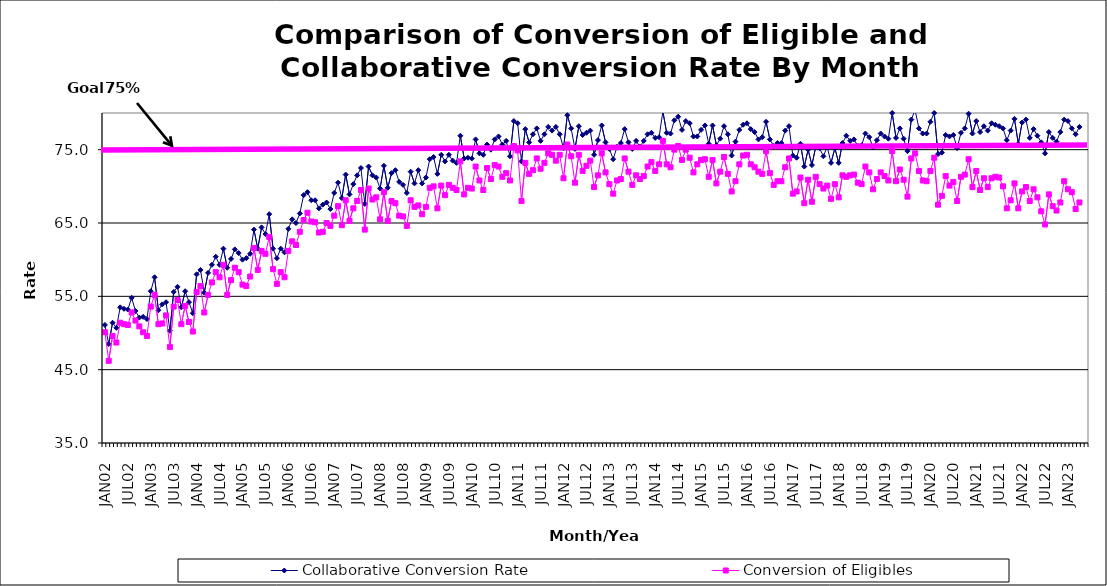
| Category | Collaborative Conversion Rate | Conversion of Eligibles |
|---|---|---|
| JAN02 | 51.1 | 50.1 |
| FEB02 | 48.5 | 46.2 |
| MAR02 | 51.4 | 49.6 |
| APR02 | 50.7 | 48.7 |
| MAY02 | 53.5 | 51.4 |
| JUN02 | 53.3 | 51.2 |
| JUL02 | 53.2 | 51.1 |
| AUG02 | 54.8 | 52.8 |
| SEP02 | 53 | 51.7 |
| OCT02 | 52.1 | 50.9 |
| NOV02 | 52.2 | 50.1 |
| DEC02 | 51.9 | 49.6 |
| JAN03 | 55.7 | 53.6 |
| FEB03 | 57.6 | 55.2 |
| MAR03 | 53.1 | 51.2 |
| APR03 | 53.9 | 51.3 |
| MAY03 | 54.2 | 52.4 |
| JUN03 | 50.3 | 48.1 |
| JUL03 | 55.6 | 53.6 |
| AUG03 | 56.3 | 54.5 |
| SEP03 | 53.5 | 51.2 |
| OCT03 | 55.7 | 53.7 |
| NOV03 | 54.2 | 51.5 |
| DEC03 | 52.7 | 50.2 |
| JAN04 | 58 | 55.6 |
| FEB04 | 58.6 | 56.4 |
| MAR04 | 55.5 | 52.8 |
| APR04 | 58.2 | 55.2 |
| MAY04 | 59.3 | 56.9 |
| JUN04 | 60.4 | 58.3 |
| JUL04 | 59.3 | 57.6 |
| AUG04 | 61.5 | 59.3 |
| SEP04 | 58.9 | 55.2 |
| OCT04 | 60.1 | 57.2 |
| NOV04 | 61.4 | 58.9 |
| DEC04 | 60.9 | 58.3 |
| JAN05 | 60 | 56.6 |
| FEB05 | 60.2 | 56.4 |
| MAR05 | 60.8 | 57.7 |
| APR05 | 64.1 | 61.6 |
| MAY05 | 61.5 | 58.6 |
| JUN05 | 64.4 | 61.2 |
| JUL05 | 63.5 | 60.8 |
| AUG05 | 66.2 | 63.1 |
| SEP05 | 61.5 | 58.7 |
| OCT05 | 60.2 | 56.7 |
| NOV05 | 61.5 | 58.3 |
| DEC05 | 61 | 57.6 |
| JAN06 | 64.2 | 61.2 |
| FEB06 | 65.5 | 62.5 |
| MAR06 | 65 | 62 |
| APR06 | 66.3 | 63.8 |
| MAY06 | 68.8 | 65.4 |
| JUN06 | 69.2 | 66.4 |
| JUL06 | 68.1 | 65.2 |
| AUG06 | 68.1 | 65.1 |
| SEP06 | 67 | 63.7 |
| OCT06 | 67.5 | 63.8 |
| NOV06 | 67.8 | 65 |
| DEC06 | 66.9 | 64.6 |
| JAN07 | 69.1 | 66 |
| FEB07 | 70.5 | 67.3 |
| MAR07 | 68.4 | 64.7 |
| APR07 | 71.6 | 68.1 |
| MAY07 | 68.9 | 65.3 |
| JUN07 | 70.3 | 67 |
| JUL07 | 71.5 | 68 |
| AUG07 | 72.5 | 69.5 |
| SEP07 | 67.6 | 64.1 |
| OCT07 | 72.7 | 69.7 |
| NOV07 | 71.5 | 68.2 |
| DEC07 | 71.2 | 68.5 |
| JAN08 | 69.7 | 65.5 |
| FEB08 | 72.8 | 69.2 |
| MAR08 | 69.8 | 65.3 |
| APR08 | 71.8 | 68 |
| MAY08 | 72.2 | 67.7 |
| JUN08 | 70.6 | 66 |
| JUL08 | 70.2 | 65.9 |
| AUG08 | 69.1 | 64.6 |
| SEP08 | 72 | 68.1 |
| OCT08 | 70.4 | 67.2 |
| NOV08 | 72.2 | 67.4 |
| DEC08 | 70.4 | 66.2 |
| JAN09 | 71.2 | 67.2 |
| FEB09 | 73.7 | 69.8 |
| MAR09 | 74 | 70 |
| APR09 | 71.7 | 67 |
| MAY09 | 74.3 | 70.1 |
| JUN09 | 73.4 | 68.8 |
| JUL09 | 74.3 | 70.2 |
| AUG09 | 73.5 | 69.8 |
| SEP09 | 73.2 | 69.5 |
| OCT09 | 76.9 | 73.4 |
| NOV09 | 73.8 | 68.9 |
| DEC09 | 73.9 | 69.8 |
| JAN10 | 73.8 | 69.7 |
| FEB10 | 76.4 | 72.7 |
| MAR10 | 74.5 | 70.8 |
| APR10 | 74.3 | 69.5 |
| MAY10 | 75.7 | 72.5 |
| JUN10 | 75 | 71 |
| JUL10 | 76.4 | 72.9 |
| AUG10 | 76.8 | 72.7 |
| SEP10 | 75.7 | 71.3 |
| OCT10 | 76.2 | 71.8 |
| NOV10 | 74.1 | 70.8 |
| DEC10 | 78.9 | 75.5 |
| JAN11 | 78.6 | 74.9 |
| FEB11 | 73.4 | 68 |
| MAR11 | 77.8 | 73.2 |
| APR11 | 76 | 71.7 |
| MAY11 | 77.1 | 72.2 |
| JUN11 | 77.9 | 73.8 |
| JUL11 | 76.2 | 72.4 |
| AUG11 | 77.1 | 73.2 |
| SEP11 | 78.1 | 74.5 |
| OCT11 | 77.6 | 74.3 |
| NOV11 | 78.1 | 73.5 |
| DEC11 | 77.1 | 74.3 |
| JAN12 | 75.2 | 71.1 |
| FEB12 | 79.7 | 75.7 |
| MAR12 | 77.9 | 74.1 |
| APR12 | 75.1 | 70.5 |
| MAY12 | 78.2 | 74.3 |
| JUN12 | 77 | 72.1 |
| JUL12 | 77.3 | 72.8 |
| AUG12 | 77.6 | 73.5 |
| SEP12 | 74.3 | 69.9 |
| OCT12 | 76.3 | 71.5 |
| NOV12 | 78.3 | 74.5 |
| DEC12 | 76 | 71.9 |
| JAN13 | 75.1 | 70.3 |
| FEB13 | 73.7 | 69 |
| MAR13 | 75.4 | 70.8 |
| APR13 | 75.9 | 71 |
| MAY13 | 77.8 | 73.8 |
| JUN13 | 76 | 72 |
| JUL13 | 75.1 | 70.2 |
| AUG13 | 76.2 | 71.5 |
| SEP13 | 75.4 | 71 |
| OCT13 | 76.2 | 71.4 |
| NOV13 | 77.1 | 72.7 |
| DEC13 | 77.3 | 73.3 |
| JAN14 | 76.6 | 72.1 |
| FEB14 | 76.7 | 73 |
| MAR14 | 80.2 | 76.2 |
| APR14 | 77.3 | 73 |
| MAY14 | 77.2 | 72.6 |
| JUN14 | 79 | 75 |
| JUL14 | 79.5 | 75.5 |
| AUG14 | 77.7 | 73.6 |
| SEP14 | 78.9 | 75 |
| OCT14 | 78.6 | 73.9 |
| NOV14 | 76.8 | 71.9 |
| DEC14 | 76.8 | 73 |
| JAN15 | 77.7 | 73.6 |
| FEB15 | 78.3 | 73.7 |
| MAR15 | 75.8 | 71.3 |
| APR15 | 78.3 | 73.6 |
| MAY15 | 75.6 | 70.4 |
| JUN15 | 76.5 | 72 |
| JUL15 | 78.2 | 74 |
| AUG15 | 77.1 | 71.7 |
| SEP15 | 74.2 | 69.3 |
| OCT15 | 76.1 | 70.7 |
| NOV15 | 77.7 | 73 |
| DEC15 | 78.4 | 74.2 |
| JAN16 | 78.6 | 74.3 |
| FEB16 | 77.8 | 73 |
| MAR16 | 77.4 | 72.6 |
| APR16 | 76.4 | 72 |
| MAY16 | 76.7 | 71.7 |
| JUN16 | 78.8 | 74.8 |
| JUL16 | 76.4 | 71.8 |
| AUG16 | 75.5 | 70.2 |
| SEP16 | 75.9 | 70.7 |
| OCT16 | 75.9 | 70.7 |
| NOV16 | 77.6 | 72.6 |
| DEC16 | 78.2 | 73.8 |
| JAN17 | 74.2 | 69 |
| FEB17 | 73.9 | 69.3 |
| MAR17 | 75.8 | 71.2 |
| APR17 | 72.7 | 67.7 |
| MAY17 | 75 | 70.9 |
| JUN17 | 72.9 | 67.9 |
| JUL17 | 75.4 | 71.3 |
| AUG17 | 75.2 | 70.3 |
| SEP17 | 74.1 | 69.7 |
| OCT17 | 75.4 | 70.1 |
| NOV17 | 73.2 | 68.3 |
| DEC17 | 75.2 | 70.3 |
| JAN18 | 73.2 | 68.5 |
| FEB18 | 75.9 | 71.5 |
| MAR18 | 76.9 | 71.3 |
| APR18 | 76.2 | 71.5 |
| MAY18 | 76.4 | 71.6 |
| JUN18 | 75.5 | 70.5 |
| JUL18 | 75.6 | 70.3 |
| AUG18 | 77.2 | 72.7 |
| SEP18 | 76.7 | 71.9 |
| OCT18 | 75.3 | 69.6 |
| NOV18 | 76.3 | 71 |
| DEC18 | 77.2 | 71.9 |
| JAN19 | 76.8 | 71.4 |
| FEB19 | 76.5 | 70.8 |
| MAR19 | 80 | 74.8 |
| APR19 | 76.6 | 70.7 |
| MAY19 | 77.9 | 72.3 |
| JUN19 | 76.5 | 70.9 |
| JUL19 | 74.8 | 68.6 |
| AUG19 | 79.1 | 73.8 |
| SEP19 | 80.4 | 74.5 |
| OCT19 | 77.9 | 72.1 |
| NOV19 | 77.2 | 70.8 |
| DEC19 | 77.2 | 70.7 |
| JAN20 | 78.8 | 72.1 |
| FEB20 | 80 | 73.9 |
| MAR20 | 74.4 | 67.5 |
| APR20 | 74.6 | 68.7 |
| MAY20 | 77 | 71.4 |
| JUN20 | 76.8 | 70.1 |
| JUL20 | 77 | 70.6 |
| AUG20 | 75.2 | 68 |
| SEP20 | 77.3 | 71.3 |
| OCT20 | 77.9 | 71.6 |
| NOV20 | 79.9 | 73.7 |
| DEC20 | 77.2 | 69.9 |
| JAN21 | 78.9 | 72.1 |
| FEB21 | 77.4 | 69.5 |
| MAR21 | 78.2 | 71.1 |
| APR21 | 77.6 | 69.9 |
| MAY21 | 78.6 | 71.1 |
| JUN21 | 78.4 | 71.3 |
| JUL21 | 78.2 | 71.2 |
| AUG21 | 77.9 | 70 |
| SEP21 | 76.3 | 67 |
| OCT21 | 77.6 | 68.1 |
| NOV21 | 79.2 | 70.4 |
| DEC21 | 75.8 | 67 |
| JAN22 | 78.7 | 69.3 |
| FEB22 | 79.1 | 69.9 |
| MAR22 | 76.6 | 68 |
| APR22 | 77.8 | 69.6 |
| MAY22 | 76.9 | 68.5 |
| JUN22 | 76 | 66.6 |
| JUL22 | 74.5 | 64.8 |
| AUG22 | 77.4 | 68.9 |
| SEP22 | 76.6 | 67.3 |
| OCT22 | 76.1 | 66.7 |
| NOV22 | 77.4 | 67.8 |
| DEC22 | 79.1 | 70.7 |
| JAN23 | 78.9 | 69.6 |
| FEB23 | 77.9 | 69.2 |
| MAR23 | 77.1 | 66.9 |
| APR23 | 78.1 | 67.8 |